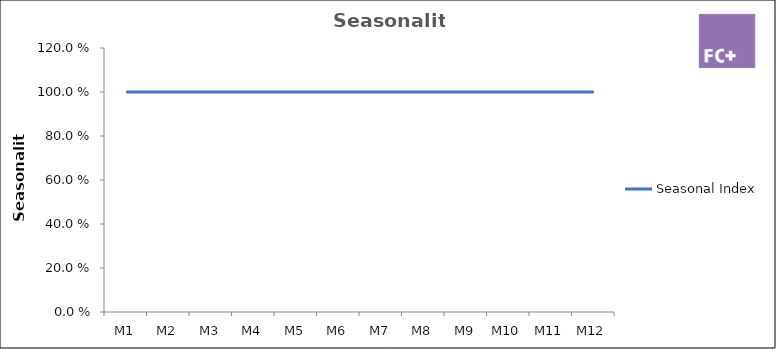
| Category | Seasonal Index |
|---|---|
| M1 | 1 |
| M2 | 1 |
| M3 | 1 |
| M4 | 1 |
| M5 | 1 |
| M6 | 1 |
| M7 | 1 |
| M8 | 1 |
| M9 | 1 |
| M10 | 1 |
| M11 | 1 |
| M12 | 1 |